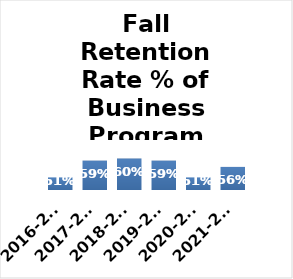
| Category | Series 0 |
|---|---|
| 2016-2017 (n=144) | 0.51 |
| 2017-2018 (n=146) | 0.59 |
| 2018-2019 (n=111) | 0.6 |
| 2019-2020 (n=82) | 0.59 |
| 2020-2021 (n=122) | 0.51 |
| 2021-2022 (n=97) | 0.56 |